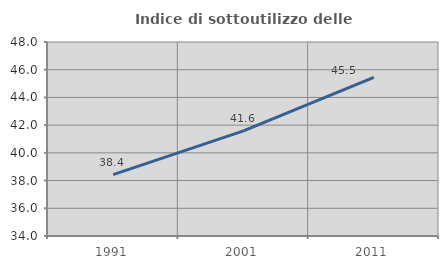
| Category | Indice di sottoutilizzo delle abitazioni  |
|---|---|
| 1991.0 | 38.435 |
| 2001.0 | 41.586 |
| 2011.0 | 45.455 |